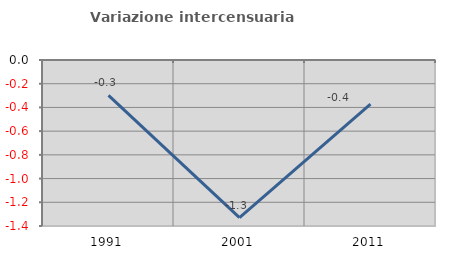
| Category | Variazione intercensuaria annua |
|---|---|
| 1991.0 | -0.298 |
| 2001.0 | -1.33 |
| 2011.0 | -0.373 |